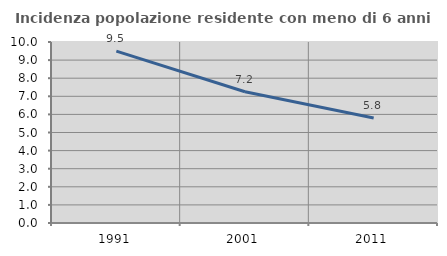
| Category | Incidenza popolazione residente con meno di 6 anni |
|---|---|
| 1991.0 | 9.495 |
| 2001.0 | 7.249 |
| 2011.0 | 5.799 |